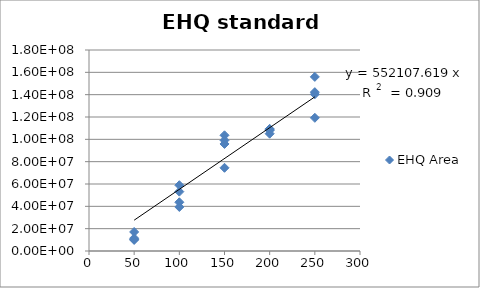
| Category | EHQ Area |
|---|---|
| 250.0 | 119274213.506 |
| 250.0 | 155926006.516 |
| 250.0 | 140368426.744 |
| 250.0 | 142255171.27 |
| 200.0 | 109357798.184 |
| 200.0 | 107996262.188 |
| 200.0 | 108980192.69 |
| 200.0 | 105052855.811 |
| 150.0 | 103617646.373 |
| 150.0 | 74523245.811 |
| 150.0 | 95861246.628 |
| 150.0 | 99128736.404 |
| 100.0 | 39428527.367 |
| 100.0 | 58913779.648 |
| 100.0 | 53147051.32 |
| 100.0 | 43649112.776 |
| 50.0 | 11470273.722 |
| 50.0 | 17047826.979 |
| 50.0 | 9882992.127 |
| 50.0 | 10445623.299 |